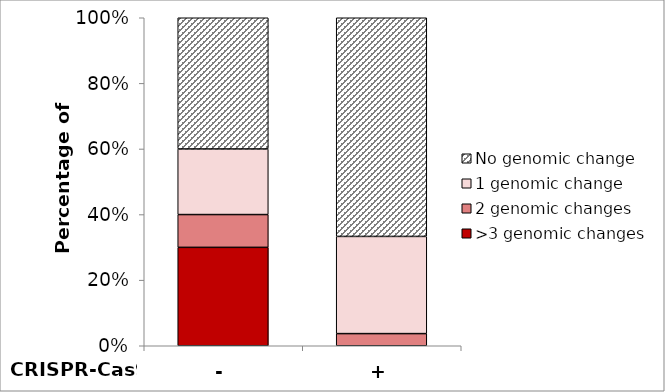
| Category | >3 genomic changes | 2 genomic changes | 1 genomic change | No genomic change |
|---|---|---|---|---|
| - | 30 | 10 | 20 | 40 |
| + | 0 | 3.704 | 29.63 | 66.667 |